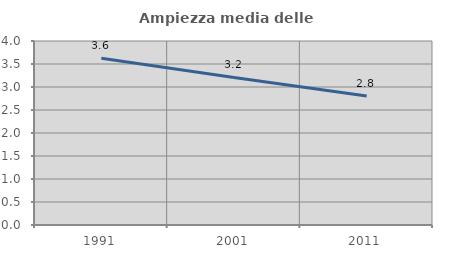
| Category | Ampiezza media delle famiglie |
|---|---|
| 1991.0 | 3.627 |
| 2001.0 | 3.207 |
| 2011.0 | 2.805 |